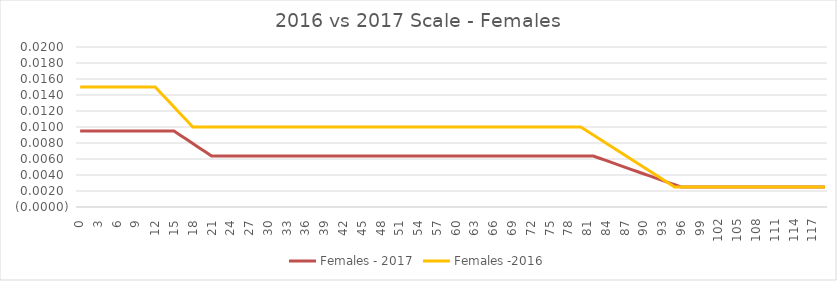
| Category | Females - 2017 | Females -2016 |
|---|---|---|
| 0.0 | 0.01 | 0.015 |
| 1.0 | 0.01 | 0.015 |
| 2.0 | 0.01 | 0.015 |
| 3.0 | 0.01 | 0.015 |
| 4.0 | 0.01 | 0.015 |
| 5.0 | 0.01 | 0.015 |
| 6.0 | 0.01 | 0.015 |
| 7.0 | 0.01 | 0.015 |
| 8.0 | 0.01 | 0.015 |
| 9.0 | 0.01 | 0.015 |
| 10.0 | 0.01 | 0.015 |
| 11.0 | 0.01 | 0.015 |
| 12.0 | 0.01 | 0.015 |
| 13.0 | 0.01 | 0.014 |
| 14.0 | 0.01 | 0.013 |
| 15.0 | 0.01 | 0.012 |
| 16.0 | 0.009 | 0.012 |
| 17.0 | 0.008 | 0.011 |
| 18.0 | 0.008 | 0.01 |
| 19.0 | 0.007 | 0.01 |
| 20.0 | 0.007 | 0.01 |
| 21.0 | 0.006 | 0.01 |
| 22.0 | 0.006 | 0.01 |
| 23.0 | 0.006 | 0.01 |
| 24.0 | 0.006 | 0.01 |
| 25.0 | 0.006 | 0.01 |
| 26.0 | 0.006 | 0.01 |
| 27.0 | 0.006 | 0.01 |
| 28.0 | 0.006 | 0.01 |
| 29.0 | 0.006 | 0.01 |
| 30.0 | 0.006 | 0.01 |
| 31.0 | 0.006 | 0.01 |
| 32.0 | 0.006 | 0.01 |
| 33.0 | 0.006 | 0.01 |
| 34.0 | 0.006 | 0.01 |
| 35.0 | 0.006 | 0.01 |
| 36.0 | 0.006 | 0.01 |
| 37.0 | 0.006 | 0.01 |
| 38.0 | 0.006 | 0.01 |
| 39.0 | 0.006 | 0.01 |
| 40.0 | 0.006 | 0.01 |
| 41.0 | 0.006 | 0.01 |
| 42.0 | 0.006 | 0.01 |
| 43.0 | 0.006 | 0.01 |
| 44.0 | 0.006 | 0.01 |
| 45.0 | 0.006 | 0.01 |
| 46.0 | 0.006 | 0.01 |
| 47.0 | 0.006 | 0.01 |
| 48.0 | 0.006 | 0.01 |
| 49.0 | 0.006 | 0.01 |
| 50.0 | 0.006 | 0.01 |
| 51.0 | 0.006 | 0.01 |
| 52.0 | 0.006 | 0.01 |
| 53.0 | 0.006 | 0.01 |
| 54.0 | 0.006 | 0.01 |
| 55.0 | 0.006 | 0.01 |
| 56.0 | 0.006 | 0.01 |
| 57.0 | 0.006 | 0.01 |
| 58.0 | 0.006 | 0.01 |
| 59.0 | 0.006 | 0.01 |
| 60.0 | 0.006 | 0.01 |
| 61.0 | 0.006 | 0.01 |
| 62.0 | 0.006 | 0.01 |
| 63.0 | 0.006 | 0.01 |
| 64.0 | 0.006 | 0.01 |
| 65.0 | 0.006 | 0.01 |
| 66.0 | 0.006 | 0.01 |
| 67.0 | 0.006 | 0.01 |
| 68.0 | 0.006 | 0.01 |
| 69.0 | 0.006 | 0.01 |
| 70.0 | 0.006 | 0.01 |
| 71.0 | 0.006 | 0.01 |
| 72.0 | 0.006 | 0.01 |
| 73.0 | 0.006 | 0.01 |
| 74.0 | 0.006 | 0.01 |
| 75.0 | 0.006 | 0.01 |
| 76.0 | 0.006 | 0.01 |
| 77.0 | 0.006 | 0.01 |
| 78.0 | 0.006 | 0.01 |
| 79.0 | 0.006 | 0.01 |
| 80.0 | 0.006 | 0.01 |
| 81.0 | 0.006 | 0.01 |
| 82.0 | 0.006 | 0.009 |
| 83.0 | 0.006 | 0.008 |
| 84.0 | 0.006 | 0.008 |
| 85.0 | 0.006 | 0.007 |
| 86.0 | 0.005 | 0.007 |
| 87.0 | 0.005 | 0.006 |
| 88.0 | 0.005 | 0.006 |
| 89.0 | 0.004 | 0.005 |
| 90.0 | 0.004 | 0.005 |
| 91.0 | 0.004 | 0.004 |
| 92.0 | 0.004 | 0.004 |
| 93.0 | 0.003 | 0.003 |
| 94.0 | 0.003 | 0.003 |
| 95.0 | 0.003 | 0.002 |
| 96.0 | 0.002 | 0.002 |
| 97.0 | 0.002 | 0.002 |
| 98.0 | 0.002 | 0.002 |
| 99.0 | 0.002 | 0.002 |
| 100.0 | 0.002 | 0.002 |
| 101.0 | 0.002 | 0.002 |
| 102.0 | 0.002 | 0.002 |
| 103.0 | 0.002 | 0.002 |
| 104.0 | 0.002 | 0.002 |
| 105.0 | 0.002 | 0.002 |
| 106.0 | 0.002 | 0.002 |
| 107.0 | 0.002 | 0.002 |
| 108.0 | 0.002 | 0.002 |
| 109.0 | 0.002 | 0.002 |
| 110.0 | 0.002 | 0.002 |
| 111.0 | 0.002 | 0.002 |
| 112.0 | 0.002 | 0.002 |
| 113.0 | 0.002 | 0.002 |
| 114.0 | 0.002 | 0.002 |
| 115.0 | 0.002 | 0.002 |
| 116.0 | 0.002 | 0.002 |
| 117.0 | 0.002 | 0.002 |
| 118.0 | 0.002 | 0.002 |
| 119.0 | 0.002 | 0.002 |